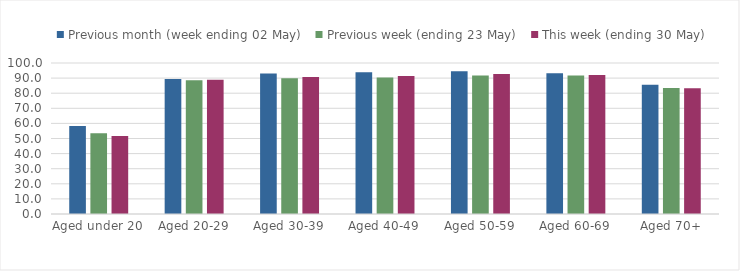
| Category | Previous month (week ending 02 May) | Previous week (ending 23 May) | This week (ending 30 May) |
|---|---|---|---|
| Aged under 20 | 58.332 | 53.469 | 51.716 |
| Aged 20-29 | 89.481 | 88.52 | 88.925 |
| Aged 30-39 | 93.051 | 89.849 | 90.742 |
| Aged 40-49 | 93.87 | 90.333 | 91.377 |
| Aged 50-59 | 94.513 | 91.716 | 92.711 |
| Aged 60-69 | 93.188 | 91.721 | 91.976 |
| Aged 70+ | 85.656 | 83.429 | 83.307 |